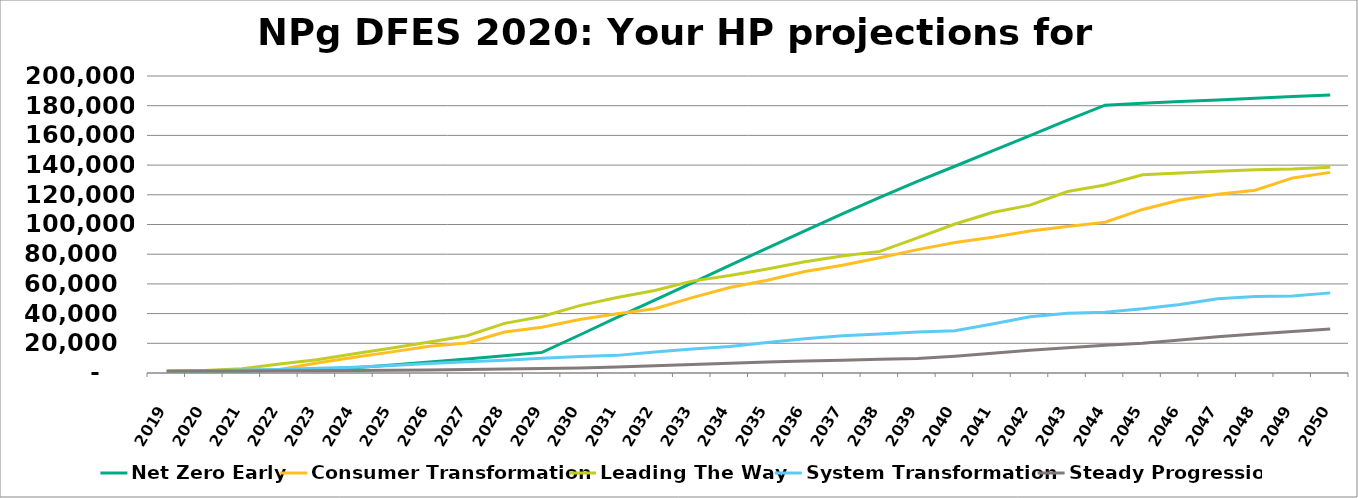
| Category | Net Zero Early | Consumer Transformation | Leading The Way | System Transformation | Steady Progression |
|---|---|---|---|---|---|
| 2019.0 | 1214 | 1234 | 1234 | 1234 | 1234 |
| 2020.0 | 1282 | 1652 | 1724 | 1523 | 1287 |
| 2021.0 | 1413 | 1901 | 2909 | 1978 | 1270 |
| 2022.0 | 1837 | 2317 | 6045 | 2390 | 1479 |
| 2023.0 | 2614 | 6668 | 8961 | 3131 | 1568 |
| 2024.0 | 3520 | 10537 | 12971 | 3935 | 1667 |
| 2025.0 | 5427 | 14223 | 16862 | 5042 | 1881 |
| 2026.0 | 7389 | 17946 | 20885 | 6405 | 2049 |
| 2027.0 | 9422 | 20244 | 25139 | 7564 | 2290 |
| 2028.0 | 11561 | 27626 | 33410 | 8624 | 2622 |
| 2029.0 | 13890 | 30797 | 38087 | 9906 | 2999 |
| 2030.0 | 25597 | 36071 | 45372 | 11046 | 3318 |
| 2031.0 | 37427 | 39931 | 50849 | 11872 | 4062 |
| 2032.0 | 49120 | 43323 | 55580 | 14205 | 4862 |
| 2033.0 | 60761 | 50751 | 61869 | 16081 | 5807 |
| 2034.0 | 72416 | 57588 | 65669 | 17771 | 6539 |
| 2035.0 | 84031 | 62402 | 70083 | 20612 | 7350 |
| 2036.0 | 95701 | 68398 | 74934 | 23030 | 8017 |
| 2037.0 | 107154 | 72621 | 78741 | 25037 | 8605 |
| 2038.0 | 118296 | 77657 | 81890 | 26244 | 9193 |
| 2039.0 | 129086 | 83071 | 90951 | 27528 | 9843 |
| 2040.0 | 139234 | 87944 | 100329 | 28436 | 11332 |
| 2041.0 | 149535 | 91453 | 108091 | 33007 | 13369 |
| 2042.0 | 159911 | 95604 | 113023 | 37866 | 15255 |
| 2043.0 | 170346 | 98680 | 122202 | 40219 | 16938 |
| 2044.0 | 180380 | 101528 | 126568 | 40918 | 18622 |
| 2045.0 | 181614 | 110137 | 133546 | 43235 | 20049 |
| 2046.0 | 182756 | 116444 | 134637 | 46172 | 22213 |
| 2047.0 | 183897 | 120348 | 135925 | 50049 | 24384 |
| 2048.0 | 185028 | 123063 | 136857 | 51579 | 26262 |
| 2049.0 | 186154 | 131356 | 137378 | 51816 | 28015 |
| 2050.0 | 187275 | 135100 | 138579 | 53956 | 29691 |